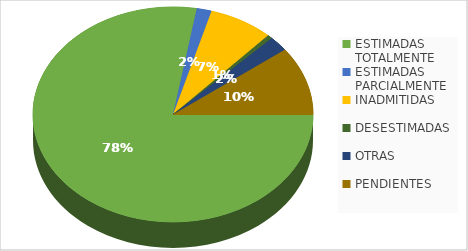
| Category | Series 0 |
|---|---|
| ESTIMADAS TOTALMENTE | 136 |
| ESTIMADAS PARCIALMENTE | 3 |
| INADMITIDAS | 13 |
| DESESTIMADAS | 1 |
| OTRAS | 4 |
| PENDIENTES | 18 |